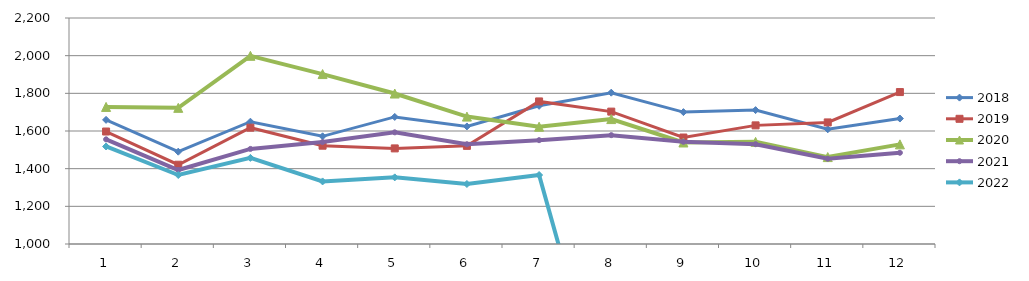
| Category | 2018 | 2019 | 2020 | 2021 | 2022 |
|---|---|---|---|---|---|
| 0 | 1659.233 | 1597.182 | 1727.767 | 1555.724 | 1517.795 |
| 1 | 1490.116 | 1420.981 | 1722.949 | 1392.893 | 1366.356 |
| 2 | 1649.429 | 1617.601 | 1999.15 | 1504.855 | 1457.257 |
| 3 | 1571.732 | 1521.999 | 1902.268 | 1541.039 | 1332.205 |
| 4 | 1674.727 | 1507.654 | 1798.925 | 1592.865 | 1353.783 |
| 5 | 1624.201 | 1521.033 | 1676.477 | 1529.566 | 1318.651 |
| 6 | 1733.621 | 1757.049 | 1622.712 | 1551.412 | 1366.276 |
| 7 | 1803.444 | 1702.894 | 1663.262 | 1577.956 | 0 |
| 8 | 1700.265 | 1565.361 | 1539.017 | 1542.78 | 0 |
| 9 | 1710.862 | 1629.894 | 1542.307 | 1529.928 | 0 |
| 10 | 1609.178 | 1645.62 | 1461.483 | 1452.733 | 0 |
| 11 | 1666.129 | 1806.739 | 1529.116 | 1484.399 | 0 |